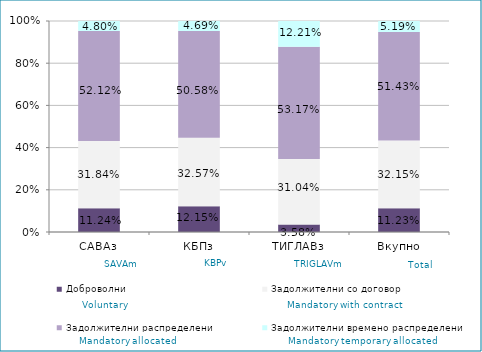
| Category | Доброволни  | Задолжителни со договор  | Задолжителни распределени  | Задолжителни времено распределени  |
|---|---|---|---|---|
| САВАз | 0.112 | 0.318 | 0.521 | 0.048 |
| КБПз | 0.122 | 0.326 | 0.506 | 0.047 |
| ТИГЛАВз | 0.036 | 0.31 | 0.532 | 0.122 |
| Вкупно | 0.112 | 0.322 | 0.514 | 0.052 |